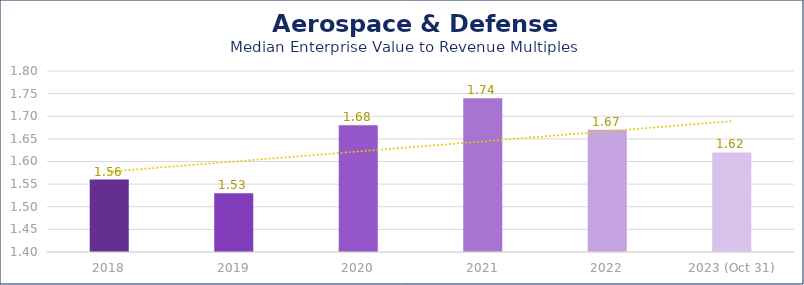
| Category | Aerospace & Defense |
|---|---|
| 2018 | 1.56 |
| 2019 | 1.53 |
| 2020 | 1.68 |
| 2021 | 1.74 |
| 2022 | 1.67 |
| 2023 (Oct 31) | 1.62 |